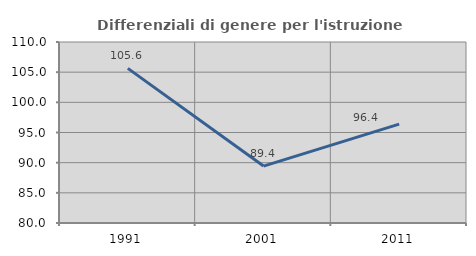
| Category | Differenziali di genere per l'istruzione superiore |
|---|---|
| 1991.0 | 105.628 |
| 2001.0 | 89.434 |
| 2011.0 | 96.385 |